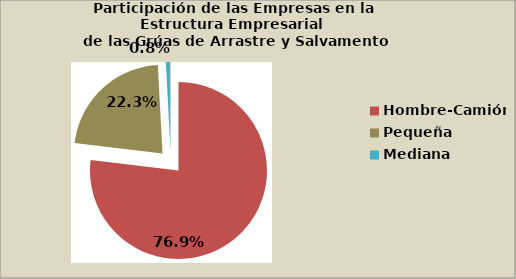
| Category | Series 0 |
|---|---|
| Hombre-Camión | 76.886 |
| Pequeña | 22.271 |
| Mediana | 0.803 |
| Grande | 0.04 |